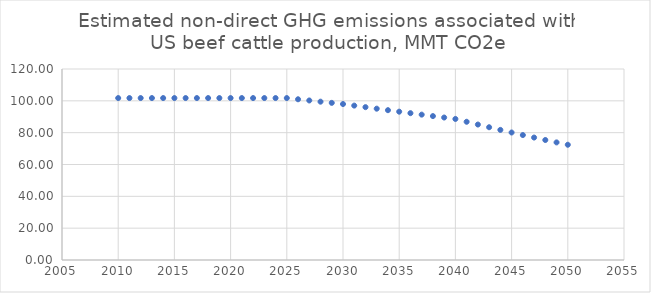
| Category | Estimated non-direct GHG emissions associated with US beef cattle production, MMT CO2e |
|---|---|
| 2010.0 | 101.745 |
| 2011.0 | 101.745 |
| 2012.0 | 101.745 |
| 2013.0 | 101.745 |
| 2014.0 | 101.745 |
| 2015.0 | 101.745 |
| 2016.0 | 101.745 |
| 2017.0 | 101.745 |
| 2018.0 | 101.745 |
| 2019.0 | 101.745 |
| 2020.0 | 101.745 |
| 2021.0 | 101.745 |
| 2022.0 | 101.745 |
| 2023.0 | 101.745 |
| 2024.0 | 101.745 |
| 2025.0 | 101.745 |
| 2026.0 | 100.982 |
| 2027.0 | 100.224 |
| 2028.0 | 99.472 |
| 2029.0 | 98.726 |
| 2030.0 | 97.986 |
| 2031.0 | 97.006 |
| 2032.0 | 96.036 |
| 2033.0 | 95.076 |
| 2034.0 | 94.125 |
| 2035.0 | 93.184 |
| 2036.0 | 92.252 |
| 2037.0 | 91.329 |
| 2038.0 | 90.416 |
| 2039.0 | 89.512 |
| 2040.0 | 88.617 |
| 2041.0 | 86.844 |
| 2042.0 | 85.108 |
| 2043.0 | 83.405 |
| 2044.0 | 81.737 |
| 2045.0 | 80.103 |
| 2046.0 | 78.5 |
| 2047.0 | 76.93 |
| 2048.0 | 75.392 |
| 2049.0 | 73.884 |
| 2050.0 | 72.406 |